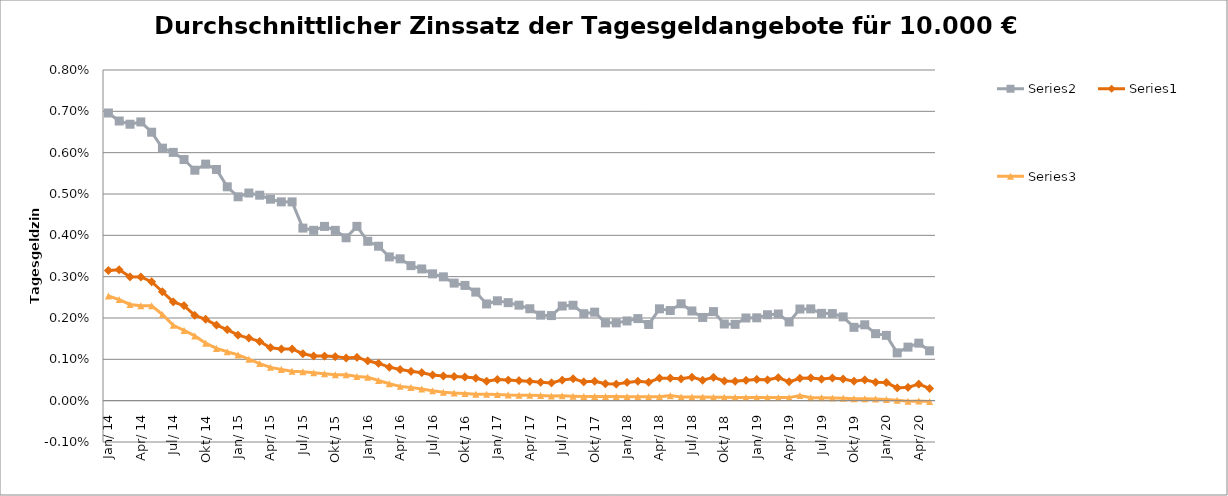
| Category | Series 1 | Series 0 | Series 2 |
|---|---|---|---|
| 2014-01-01 | 0.007 | 0.003 | 0.003 |
| 2014-02-01 | 0.007 | 0.003 | 0.002 |
| 2014-03-01 | 0.007 | 0.003 | 0.002 |
| 2014-04-01 | 0.007 | 0.003 | 0.002 |
| 2014-05-01 | 0.006 | 0.003 | 0.002 |
| 2014-06-01 | 0.006 | 0.003 | 0.002 |
| 2014-07-01 | 0.006 | 0.002 | 0.002 |
| 2014-08-01 | 0.006 | 0.002 | 0.002 |
| 2014-09-01 | 0.006 | 0.002 | 0.002 |
| 2014-10-01 | 0.006 | 0.002 | 0.001 |
| 2014-11-01 | 0.006 | 0.002 | 0.001 |
| 2014-12-01 | 0.005 | 0.002 | 0.001 |
| 2015-01-01 | 0.005 | 0.002 | 0.001 |
| 2015-02-01 | 0.005 | 0.002 | 0.001 |
| 2015-03-01 | 0.005 | 0.001 | 0.001 |
| 2015-04-01 | 0.005 | 0.001 | 0.001 |
| 2015-05-01 | 0.005 | 0.001 | 0.001 |
| 2015-06-01 | 0.005 | 0.001 | 0.001 |
| 2015-07-01 | 0.004 | 0.001 | 0.001 |
| 2015-08-01 | 0.004 | 0.001 | 0.001 |
| 2015-09-01 | 0.004 | 0.001 | 0.001 |
| 2015-10-01 | 0.004 | 0.001 | 0.001 |
| 2015-11-01 | 0.004 | 0.001 | 0.001 |
| 2015-12-01 | 0.004 | 0.001 | 0.001 |
| 2016-01-01 | 0.004 | 0.001 | 0.001 |
| 2016-02-01 | 0.004 | 0.001 | 0 |
| 2016-03-01 | 0.003 | 0.001 | 0 |
| 2016-04-01 | 0.003 | 0.001 | 0 |
| 2016-05-01 | 0.003 | 0.001 | 0 |
| 2016-06-01 | 0.003 | 0.001 | 0 |
| 2016-07-01 | 0.003 | 0.001 | 0 |
| 2016-08-01 | 0.003 | 0.001 | 0 |
| 2016-09-01 | 0.003 | 0.001 | 0 |
| 2016-10-01 | 0.003 | 0.001 | 0 |
| 2016-11-01 | 0.003 | 0.001 | 0 |
| 2016-12-01 | 0.002 | 0 | 0 |
| 2017-01-01 | 0.002 | 0.001 | 0 |
| 2017-02-01 | 0.002 | 0 | 0 |
| 2017-03-01 | 0.002 | 0 | 0 |
| 2017-04-01 | 0.002 | 0 | 0 |
| 2017-05-01 | 0.002 | 0 | 0 |
| 2017-06-01 | 0.002 | 0 | 0 |
| 2017-07-01 | 0.002 | 0 | 0 |
| 2017-08-01 | 0.002 | 0.001 | 0 |
| 2017-09-01 | 0.002 | 0 | 0 |
| 2017-10-01 | 0.002 | 0 | 0 |
| 2017-11-01 | 0.002 | 0 | 0 |
| 2017-12-01 | 0.002 | 0 | 0 |
| 2018-01-01 | 0.002 | 0 | 0 |
| 2018-02-01 | 0.002 | 0 | 0 |
| 2018-03-01 | 0.002 | 0 | 0 |
| 2018-04-01 | 0.002 | 0.001 | 0 |
| 2018-05-01 | 0.002 | 0.001 | 0 |
| 2018-06-01 | 0.002 | 0.001 | 0 |
| 2018-07-01 | 0.002 | 0.001 | 0 |
| 2018-08-01 | 0.002 | 0 | 0 |
| 2018-09-01 | 0.002 | 0.001 | 0 |
| 2018-10-01 | 0.002 | 0 | 0 |
| 2018-11-01 | 0.002 | 0 | 0 |
| 2018-12-01 | 0.002 | 0 | 0 |
| 2019-01-01 | 0.002 | 0.001 | 0 |
| 2019-02-01 | 0.002 | 0.001 | 0 |
| 2019-03-01 | 0.002 | 0.001 | 0 |
| 2019-04-01 | 0.002 | 0 | 0 |
| 2019-05-01 | 0.002 | 0.001 | 0 |
| 2019-06-01 | 0.002 | 0.001 | 0 |
| 2019-07-01 | 0.002 | 0.001 | 0 |
| 2019-08-01 | 0.002 | 0.001 | 0 |
| 2019-09-01 | 0.002 | 0.001 | 0 |
| 2019-10-01 | 0.002 | 0 | 0 |
| 2019-11-01 | 0.002 | 0.001 | 0 |
| 2019-12-01 | 0.002 | 0 | 0 |
| 2020-01-01 | 0.002 | 0 | 0 |
| 2020-02-01 | 0.001 | 0 | 0 |
| 2020-03-01 | 0.001 | 0 | 0 |
| 2020-04-01 | 0.001 | 0 | 0 |
| 2020-05-01 | 0.001 | 0 | 0 |